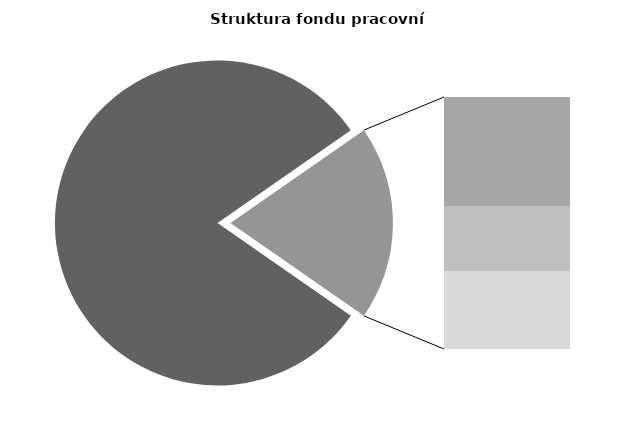
| Category | Series 0 |
|---|---|
| Průměrná měsíční odpracovaná doba bez přesčasu | 138.183 |
| Dovolená | 14.445 |
| Nemoc | 8.549 |
| Jiné | 10.19 |